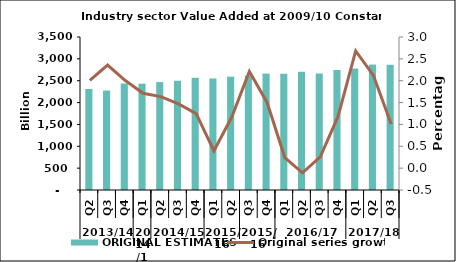
| Category | ORIGINAL ESTIMATES |
|---|---|
| 0 | 2310.459 |
| 1 | 2275.017 |
| 2 | 2436.805 |
| 3 | 2432.811 |
| 4 | 2468.619 |
| 5 | 2498.165 |
| 6 | 2566.979 |
| 7 | 2551.067 |
| 8 | 2592.903 |
| 9 | 2612.693 |
| 10 | 2663.651 |
| 11 | 2659.459 |
| 12 | 2704.937 |
| 13 | 2664.601 |
| 14 | 2745.225 |
| 15 | 2779.455 |
| 16 | 2868.999 |
| 17 | 2864.67 |